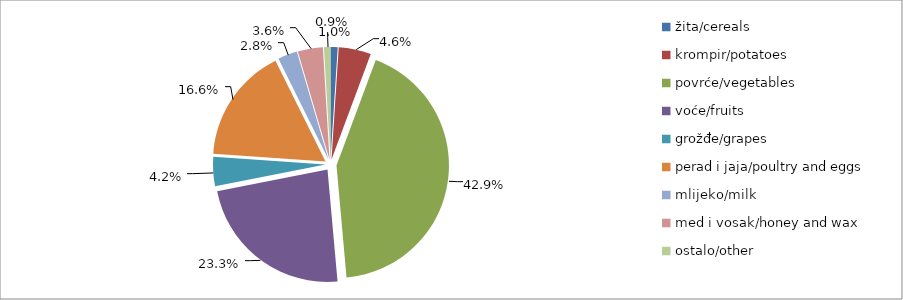
| Category | Series 0 |
|---|---|
| žita/cereals | 21544 |
| krompir/potatoes | 97681 |
| povrće/vegetables | 901862.5 |
| voće/fruits | 490031 |
| grožđe/grapes | 88540 |
| perad i jaja/poultry and eggs | 348071 |
| mlijeko/milk | 58752 |
| med i vosak/honey and wax | 75830 |
| ostalo/other | 19665 |